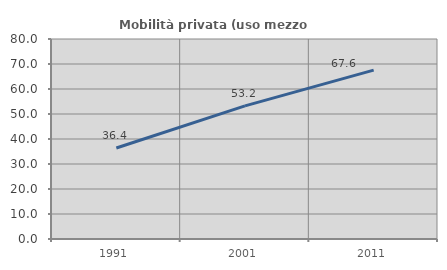
| Category | Mobilità privata (uso mezzo privato) |
|---|---|
| 1991.0 | 36.387 |
| 2001.0 | 53.245 |
| 2011.0 | 67.563 |